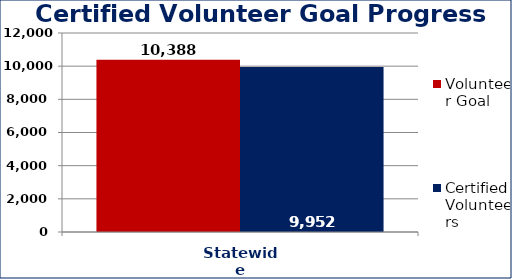
| Category | Volunteer Goal  | Certified Volunteers  |
|---|---|---|
| Statewide | 10388 | 9952 |